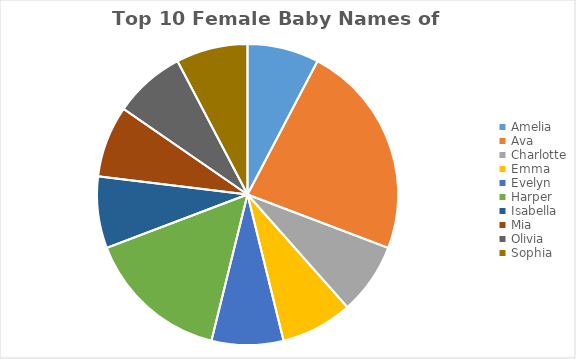
| Category | Total |
|---|---|
| Amelia | 1 |
| Ava | 3 |
| Charlotte | 1 |
| Emma | 1 |
| Evelyn | 1 |
| Harper | 2 |
| Isabella | 1 |
| Mia | 1 |
| Olivia | 1 |
| Sophia | 1 |